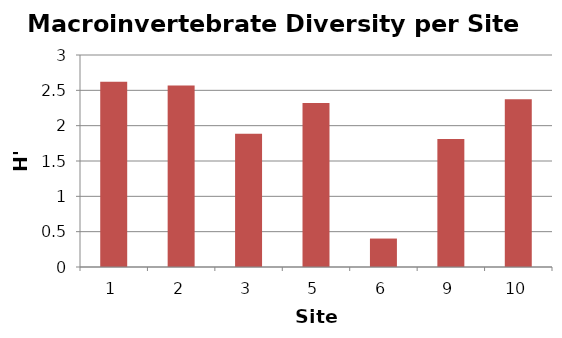
| Category | H' |
|---|---|
| 1.0 | 2.62 |
| 2.0 | 2.567 |
| 3.0 | 1.885 |
| 5.0 | 2.321 |
| 6.0 | 0.403 |
| 9.0 | 1.81 |
| 10.0 | 2.373 |